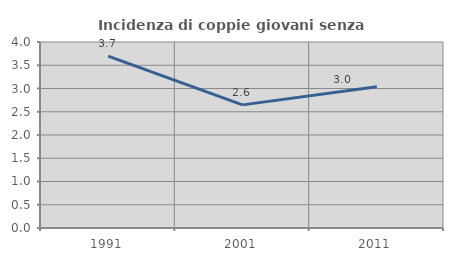
| Category | Incidenza di coppie giovani senza figli |
|---|---|
| 1991.0 | 3.698 |
| 2001.0 | 2.648 |
| 2011.0 | 3.035 |